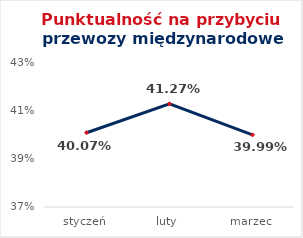
| Category | Series 0 |
|---|---|
| styczeń | 0.401 |
| luty | 0.413 |
| marzec | 0.4 |